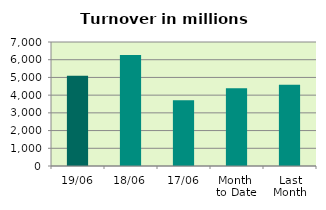
| Category | Series 0 |
|---|---|
| 19/06 | 5090.262 |
| 18/06 | 6261.25 |
| 17/06 | 3712.158 |
| Month 
to Date | 4394.361 |
| Last
Month | 4586.899 |